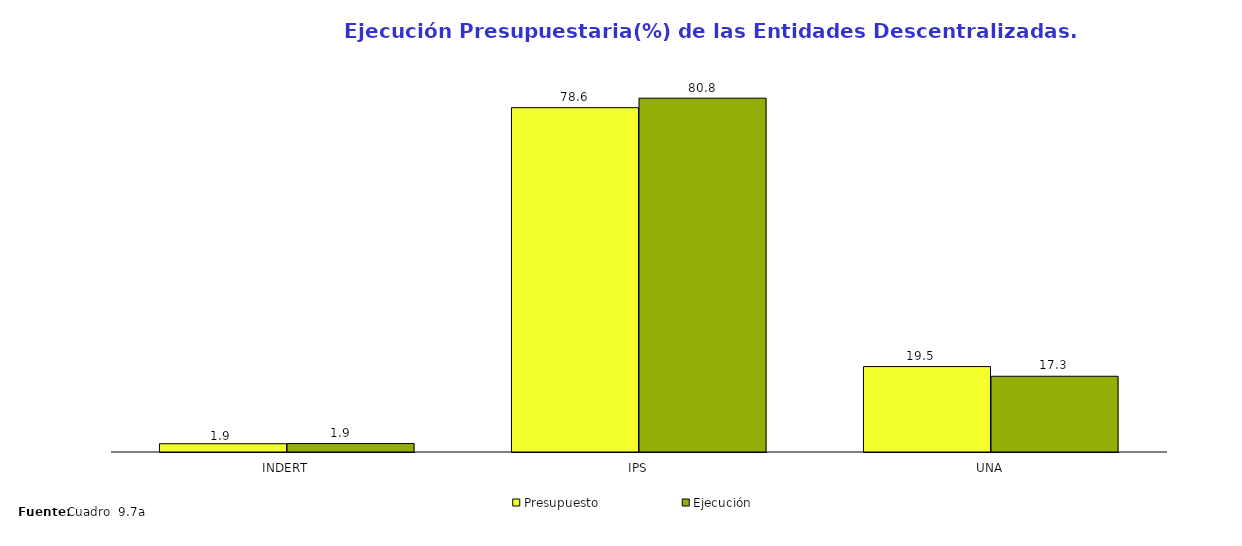
| Category | Presupuesto | Ejecución |
|---|---|---|
| INDERT | 1.884 | 1.927 |
| IPS | 78.611 | 80.781 |
| UNA | 19.505 | 17.292 |